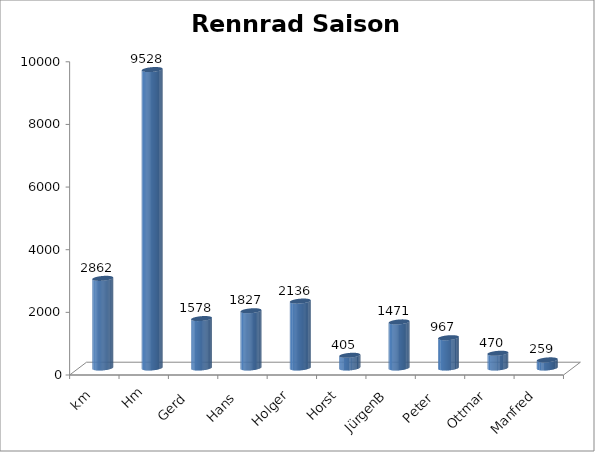
| Category | Series 0 |
|---|---|
| km | 2862 |
| Hm | 9528 |
| Gerd  | 1578 |
| Hans  | 1827 |
| Holger | 2136 |
| Horst | 405 |
| JürgenB | 1471 |
| Peter  | 967 |
| Ottmar  | 470 |
| Manfred | 259 |